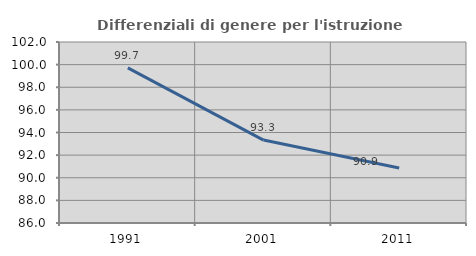
| Category | Differenziali di genere per l'istruzione superiore |
|---|---|
| 1991.0 | 99.707 |
| 2001.0 | 93.33 |
| 2011.0 | 90.854 |